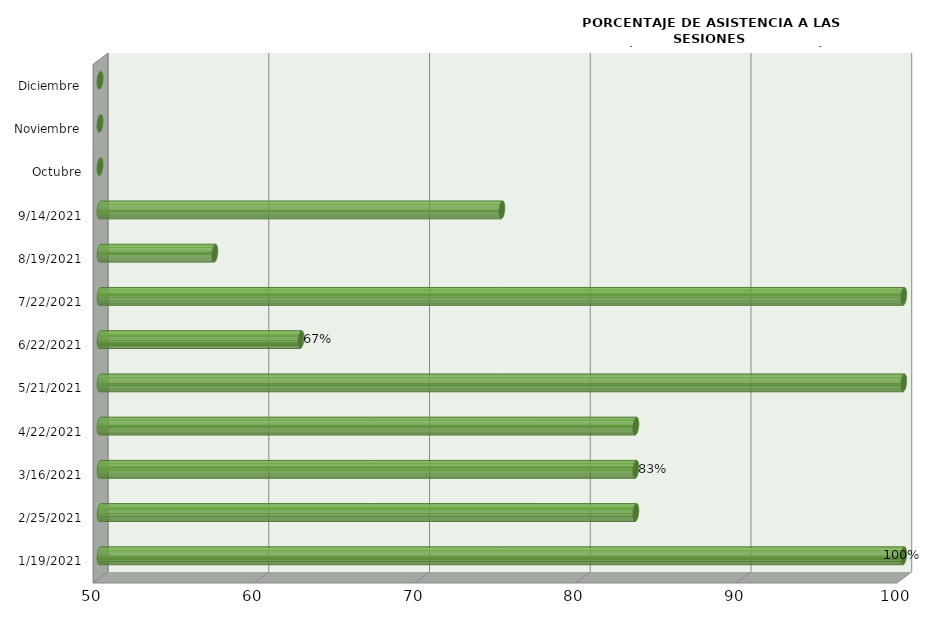
| Category | Series 0 |
|---|---|
| 19/01/2021 | 100 |
| 25/02/2021 | 83.333 |
| 16/03/2021 | 83.333 |
| 22/04/2021 | 83.333 |
| 21/05/2021 | 100 |
| 22/06/2021 | 62.5 |
| 22/07/2021 | 100 |
| 19/08/2021 | 57.143 |
| 14/09/2021 | 75 |
| Octubre | 0 |
| Noviembre | 0 |
| Diciembre | 0 |